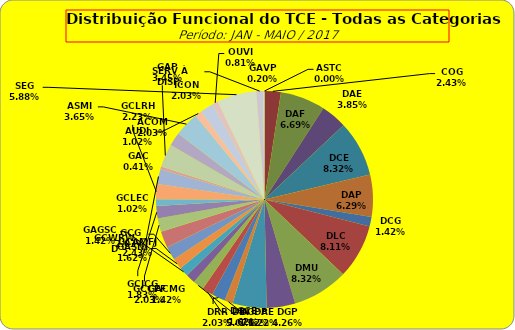
| Category | ASTC |
|---|---|
| ASTC | 0 |
| COG | 12 |
| DAF | 33 |
| DAE | 19 |
| DCE | 41 |
| DAP | 31 |
| DCG | 7 |
| DLC | 40 |
| DMU | 41 |
| DGP | 21 |
| DIN | 25 |
| DPE | 6 |
| DRR | 10 |
| DGCE | 8 |
| DGPA | 8 |
| GACMG | 7 |
| GAGSC | 7 |
| GASNI | 8 |
| GCG | 10 |
| GCAMFJ | 12 |
| GCCFF | 10 |
| GCJCG | 9 |
| GCLEC | 5 |
| GCLRH | 11 |
| GCWRWD | 11 |
| GAC | 2 |
| GAP | 17 |
| ACOM | 10 |
| ASMI | 18 |
| AUDI | 5 |
| ICON | 10 |
| OUVI | 4 |
| SEG | 29 |
| SERV À DISP. | 5 |
| GAVP | 1 |